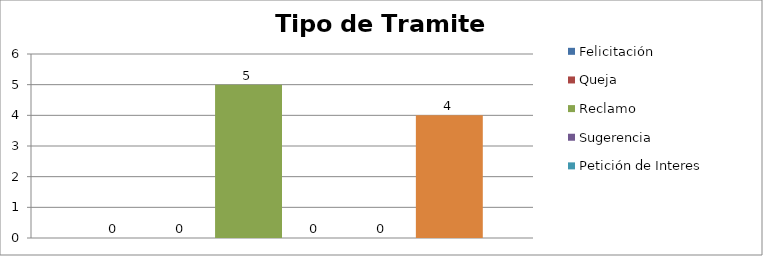
| Category | Felicitación | Queja | Reclamo | Sugerencia | Petición de Interes General | Petición de Interes Particular |
|---|---|---|---|---|---|---|
| 0 | 0 | 0 | 5 | 0 | 0 | 4 |